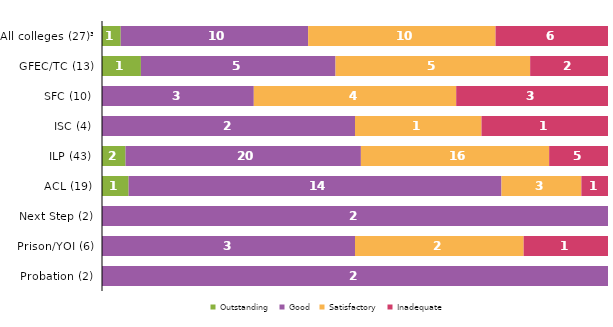
| Category | Outstanding | Good | Satisfactory | Inadequate |
|---|---|---|---|---|
| All colleges (27)³ | 1 | 10 | 10 | 6 |
| GFEC/TC (13) | 1 | 5 | 5 | 2 |
| SFC (10) | 0 | 3 | 4 | 3 |
| ISC (4) | 0 | 2 | 1 | 1 |
| ILP (43) | 2 | 20 | 16 | 5 |
| ACL (19) | 1 | 14 | 3 | 1 |
| Next Step (2) | 0 | 2 | 0 | 0 |
| Prison/YOI (6) | 0 | 3 | 2 | 1 |
| Probation (2) | 0 | 2 | 0 | 0 |